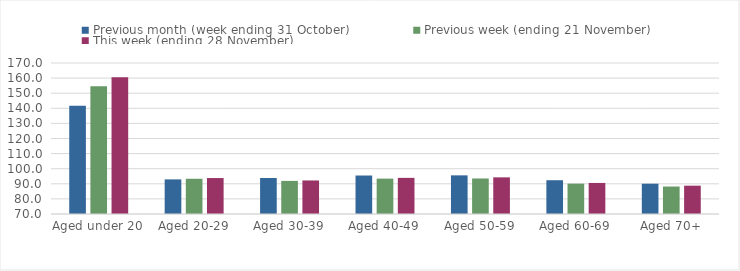
| Category | Previous month (week ending 31 October) | Previous week (ending 21 November) | This week (ending 28 November) |
|---|---|---|---|
| Aged under 20 | 141.61 | 154.57 | 160.5 |
| Aged 20-29 | 92.92 | 93.34 | 93.81 |
| Aged 30-39 | 93.86 | 91.92 | 92.21 |
| Aged 40-49 | 95.49 | 93.43 | 93.93 |
| Aged 50-59 | 95.59 | 93.52 | 94.27 |
| Aged 60-69 | 92.37 | 90.11 | 90.56 |
| Aged 70+ | 90.06 | 88.2 | 88.76 |